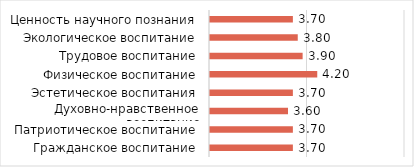
| Category | Series 2 |
|---|---|
| Гражданское воспитание | 3.7 |
| Патриотическое воспитание | 3.7 |
| Духовно-нравственное воспитание | 3.6 |
| Эстетическое воспитания | 3.7 |
| Физическое воспитание | 4.2 |
| Трудовое воспитание | 3.9 |
| Экологическое воспитание | 3.8 |
| Ценность научного познания | 3.7 |